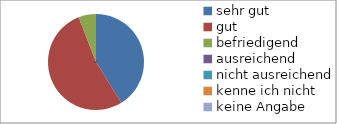
| Category | Series 0 |
|---|---|
| sehr gut | 7 |
| gut | 9 |
| befriedigend | 1 |
| ausreichend | 0 |
| nicht ausreichend | 0 |
| kenne ich nicht | 0 |
| keine Angabe | 0 |